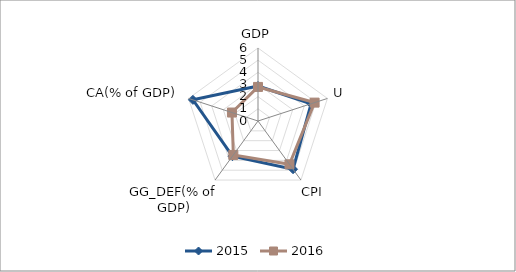
| Category | 2015 | 2016 |
|---|---|---|
| GDP | 2.88 | 2.8 |
| U | 4.592 | 4.891 |
| CPI | 4.9 | 4.4 |
| GG_DEF(% of GDP) | 3.571 | 3.448 |
| CA(% of GDP) | 5.625 | 2.25 |